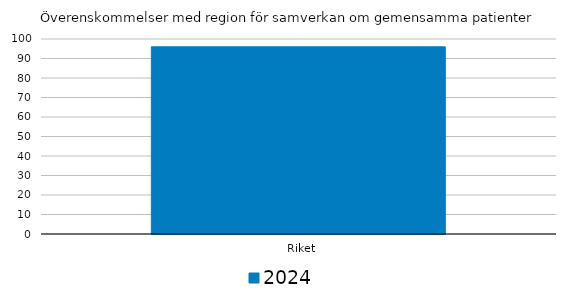
| Category | 2024 |
|---|---|
|   Riket | 96 |